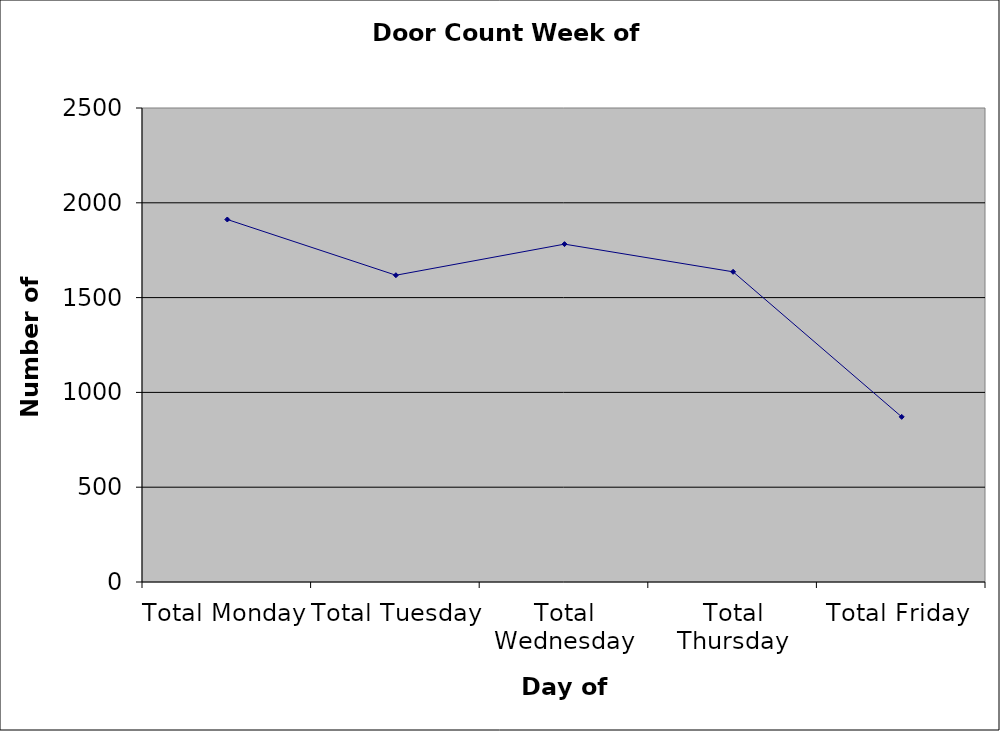
| Category | Series 0 |
|---|---|
| Total Monday | 1912 |
| Total Tuesday | 1618 |
| Total Wednesday | 1782 |
| Total Thursday | 1636 |
| Total Friday | 871 |